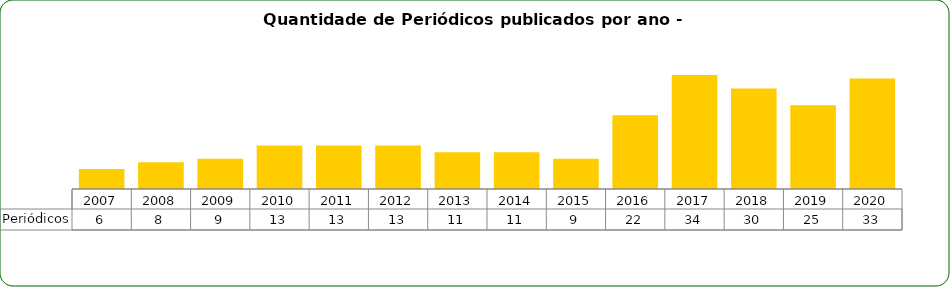
| Category | Periódicos |
|---|---|
| 2007.0 | 6 |
| 2008.0 | 8 |
| 2009.0 | 9 |
| 2010.0 | 13 |
| 2011.0 | 13 |
| 2012.0 | 13 |
| 2013.0 | 11 |
| 2014.0 | 11 |
| 2015.0 | 9 |
| 2016.0 | 22 |
| 2017.0 | 34 |
| 2018.0 | 30 |
| 2019.0 | 25 |
| 2020.0 | 33 |